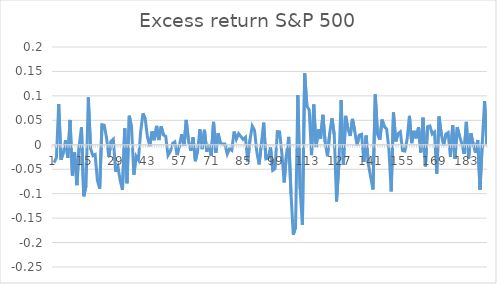
| Category | Series 0 |
|---|---|
| 0 | -0.036 |
| 1900-01-01 | -0.026 |
| 1900-01-02 | 0.083 |
| 1900-01-03 | -0.03 |
| 1900-01-04 | -0.017 |
| 1900-01-05 | 0.009 |
| 1900-01-06 | -0.027 |
| 1900-01-07 | 0.051 |
| 1900-01-08 | -0.063 |
| 1900-01-09 | -0.016 |
| 1900-01-10 | -0.083 |
| 1900-01-11 | -0.002 |
| 1900-01-12 | 0.036 |
| 1900-01-13 | -0.105 |
| 1900-01-14 | -0.084 |
| 1900-01-15 | 0.097 |
| 1900-01-16 | -0.007 |
| 1900-01-17 | -0.022 |
| 1900-01-18 | -0.02 |
| 1900-01-19 | -0.073 |
| 1900-01-20 | -0.09 |
| 1900-01-21 | 0.041 |
| 1900-01-22 | 0.04 |
| 1900-01-23 | 0.015 |
| 1900-01-24 | -0.024 |
| 1900-01-25 | 0.007 |
| 1900-01-26 | 0.011 |
| 1900-01-27 | -0.055 |
| 1900-01-28 | -0.044 |
| 1900-01-29 | -0.073 |
| 1900-01-30 | -0.092 |
| 1900-01-31 | 0.033 |
| 1900-02-01 | -0.079 |
| 1900-02-02 | 0.059 |
| 1900-02-03 | 0.035 |
| 1900-02-04 | -0.061 |
| 1900-02-05 | -0.023 |
| 1900-02-06 | -0.031 |
| 1900-02-07 | 0.027 |
| 1900-02-08 | 0.064 |
| 1900-02-09 | 0.053 |
| 1900-02-10 | 0.015 |
| 1900-02-11 | -0.003 |
| 1900-02-12 | 0.027 |
| 1900-02-13 | 0.009 |
| 1900-02-14 | 0.039 |
| 1900-02-15 | 0.01 |
| 1900-02-16 | 0.038 |
| 1900-02-17 | 0.02 |
| 1900-02-18 | 0.017 |
| 1900-02-19 | -0.022 |
| 1900-02-20 | -0.014 |
| 1900-02-21 | 0.003 |
| 1900-02-22 | 0.006 |
| 1900-02-23 | -0.021 |
| 1900-02-24 | -0.002 |
| 1900-02-25 | 0.022 |
| 1900-02-26 | -0.002 |
| 1900-02-27 | 0.051 |
| 1900-02-28 | 0.007 |
| 1900-02-28 | -0.012 |
| 1900-03-01 | 0.015 |
| 1900-03-02 | -0.034 |
| 1900-03-03 | -0.012 |
| 1900-03-04 | 0.032 |
| 1900-03-05 | -0.009 |
| 1900-03-06 | 0.031 |
| 1900-03-07 | -0.014 |
| 1900-03-08 | 0.001 |
| 1900-03-09 | -0.023 |
| 1900-03-10 | 0.047 |
| 1900-03-11 | -0.017 |
| 1900-03-12 | 0.024 |
| 1900-03-13 | 0.003 |
| 1900-03-14 | 0.001 |
| 1900-03-15 | 0.001 |
| 1900-03-16 | -0.019 |
| 1900-03-17 | -0.008 |
| 1900-03-18 | -0.011 |
| 1900-03-19 | 0.027 |
| 1900-03-20 | 0.011 |
| 1900-03-21 | 0.023 |
| 1900-03-22 | 0.017 |
| 1900-03-23 | 0.011 |
| 1900-03-24 | 0.016 |
| 1900-03-25 | -0.034 |
| 1900-03-26 | 0.011 |
| 1900-03-27 | 0.038 |
| 1900-03-28 | 0.029 |
| 1900-03-29 | -0.015 |
| 1900-03-30 | -0.04 |
| 1900-03-31 | 0.002 |
| 1900-04-01 | 0.045 |
| 1900-04-02 | -0.029 |
| 1900-04-03 | -0.027 |
| 1900-04-04 | -0.005 |
| 1900-04-05 | -0.052 |
| 1900-04-06 | -0.049 |
| 1900-04-07 | 0.027 |
| 1900-04-08 | 0.026 |
| 1900-04-09 | -0.019 |
| 1900-04-10 | -0.077 |
| 1900-04-11 | -0.021 |
| 1900-04-12 | 0.016 |
| 1900-04-13 | -0.101 |
| 1900-04-14 | -0.184 |
| 1900-04-15 | -0.169 |
| 1900-04-16 | 0.101 |
| 1900-04-17 | -0.09 |
| 1900-04-18 | -0.164 |
| 1900-04-19 | 0.146 |
| 1900-04-20 | 0.079 |
| 1900-04-21 | 0.072 |
| 1900-04-22 | -0.021 |
| 1900-04-23 | 0.082 |
| 1900-04-24 | -0.005 |
| 1900-04-25 | 0.031 |
| 1900-04-26 | 0.013 |
| 1900-04-27 | 0.061 |
| 1900-04-28 | 0.006 |
| 1900-04-29 | -0.024 |
| 1900-04-30 | 0.024 |
| 1900-05-01 | 0.054 |
| 1900-05-02 | 0.02 |
| 1900-05-03 | -0.116 |
| 1900-05-04 | -0.041 |
| 1900-05-05 | 0.091 |
| 1900-05-06 | -0.041 |
| 1900-05-07 | 0.059 |
| 1900-05-08 | 0.033 |
| 1900-05-09 | 0.018 |
| 1900-05-10 | 0.053 |
| 1900-05-11 | 0.028 |
| 1900-05-12 | -0.001 |
| 1900-05-13 | 0.02 |
| 1900-05-14 | 0.021 |
| 1900-05-15 | -0.035 |
| 1900-05-16 | 0.019 |
| 1900-05-17 | -0.04 |
| 1900-05-18 | -0.066 |
| 1900-05-19 | -0.091 |
| 1900-05-20 | 0.103 |
| 1900-05-21 | 0.021 |
| 1900-05-22 | 0.01 |
| 1900-05-23 | 0.052 |
| 1900-05-24 | 0.037 |
| 1900-05-25 | 0.032 |
| 1900-05-26 | -0.009 |
| 1900-05-27 | -0.095 |
| 1900-05-28 | 0.066 |
| 1900-05-29 | 0.007 |
| 1900-05-30 | 0.023 |
| 1900-05-31 | 0.026 |
| 1900-06-01 | -0.012 |
| 1900-06-02 | -0.013 |
| 1900-06-03 | 0.012 |
| 1900-06-04 | 0.059 |
| 1900-06-05 | 0.003 |
| 1900-06-06 | 0.029 |
| 1900-06-07 | 0.013 |
| 1900-06-08 | 0.036 |
| 1900-06-09 | -0.016 |
| 1900-06-10 | 0.055 |
| 1900-06-11 | -0.044 |
| 1900-06-12 | 0.037 |
| 1900-06-13 | 0.039 |
| 1900-06-14 | 0.022 |
| 1900-06-15 | 0.026 |
| 1900-06-16 | -0.059 |
| 1900-06-17 | 0.058 |
| 1900-06-18 | 0.021 |
| 1900-06-19 | -0.001 |
| 1900-06-20 | 0.022 |
| 1900-06-21 | 0.025 |
| 1900-06-22 | -0.025 |
| 1900-06-23 | 0.04 |
| 1900-06-24 | -0.029 |
| 1900-06-25 | 0.036 |
| 1900-06-26 | 0.018 |
| 1900-06-27 | 0.003 |
| 1900-06-28 | -0.019 |
| 1900-06-29 | 0.047 |
| 1900-06-30 | -0.028 |
| 1900-07-01 | 0.023 |
| 1900-07-02 | 0.002 |
| 1900-07-03 | -0.016 |
| 1900-07-04 | 0.01 |
| 1900-07-05 | -0.092 |
| 1900-07-06 | 0.005 |
| 1900-07-07 | 0.09 |
| 1900-07-08 | -0.001 |